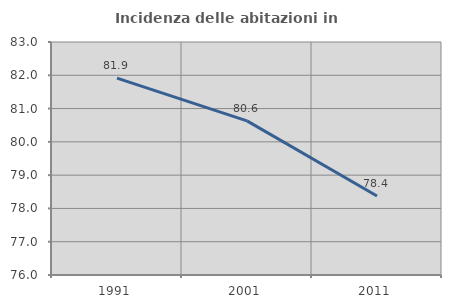
| Category | Incidenza delle abitazioni in proprietà  |
|---|---|
| 1991.0 | 81.916 |
| 2001.0 | 80.629 |
| 2011.0 | 78.375 |